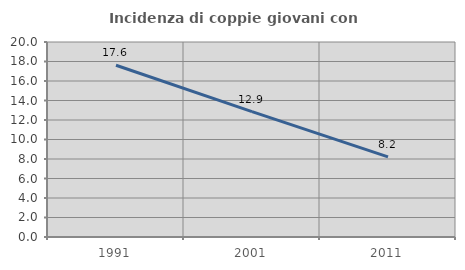
| Category | Incidenza di coppie giovani con figli |
|---|---|
| 1991.0 | 17.616 |
| 2001.0 | 12.862 |
| 2011.0 | 8.219 |